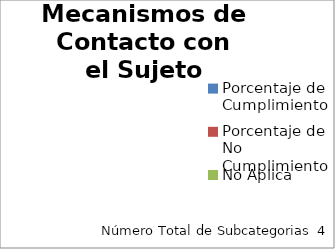
| Category | Mecanismos de Contacto con el Sujeto Obligado |
|---|---|
| Porcentaje de Cumplimiento | 0 |
| Porcentaje de No Cumplimiento | 0 |
| No Aplica | 0 |